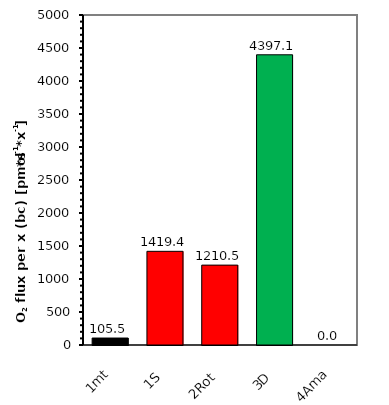
| Category | O2 flux per x (bc) |
|---|---|
| 1mt | 105.467 |
| 1S | 1419.367 |
| 2Rot | 1210.452 |
| 3D | 4397.133 |
| 4Ama | 0 |